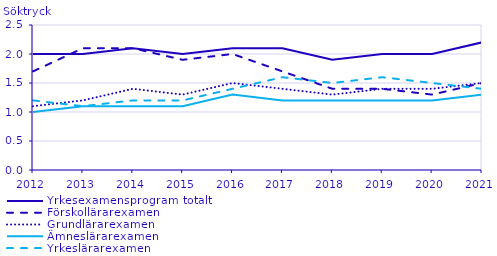
| Category | Yrkesexamensprogram totalt | Förskollärarexamen                                 | Grundlärarexamen                                   | Ämneslärarexamen                                   | Yrkeslärarexamen                                   |
|---|---|---|---|---|---|
| 2012.0 | 2 | 1.7 | 1.1 | 1 | 1.2 |
| 2013.0 | 2 | 2.1 | 1.2 | 1.1 | 1.1 |
| 2014.0 | 2.1 | 2.1 | 1.4 | 1.1 | 1.2 |
| 2015.0 | 2 | 1.9 | 1.3 | 1.1 | 1.2 |
| 2016.0 | 2.1 | 2 | 1.5 | 1.3 | 1.4 |
| 2017.0 | 2.1 | 1.7 | 1.4 | 1.2 | 1.6 |
| 2018.0 | 1.9 | 1.4 | 1.3 | 1.2 | 1.5 |
| 2019.0 | 2 | 1.4 | 1.4 | 1.2 | 1.6 |
| 2020.0 | 2 | 1.3 | 1.4 | 1.2 | 1.5 |
| 2021.0 | 2.2 | 1.5 | 1.5 | 1.3 | 1.4 |